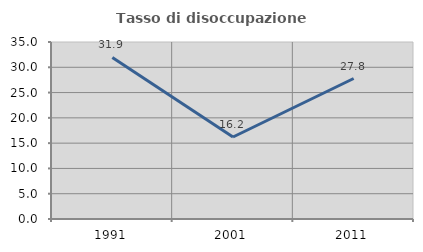
| Category | Tasso di disoccupazione giovanile  |
|---|---|
| 1991.0 | 31.944 |
| 2001.0 | 16.216 |
| 2011.0 | 27.778 |